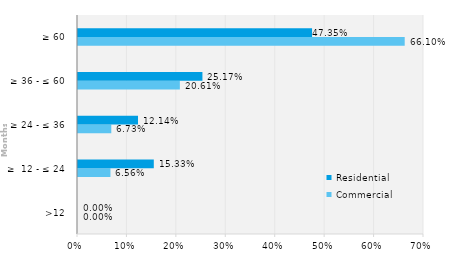
| Category | Commercial | Residential |
|---|---|---|
| >12 | 0 | 0 |
| ≥  12 - ≤ 24 | 0.066 | 0.153 |
| ≥ 24 - ≤ 36 | 0.067 | 0.121 |
| ≥ 36 - ≤ 60 | 0.206 | 0.252 |
| ≥ 60 | 0.661 | 0.474 |